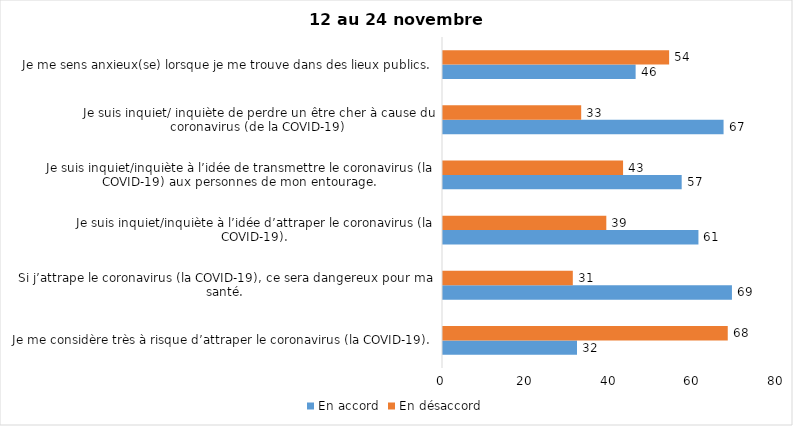
| Category | En accord | En désaccord |
|---|---|---|
| Je me considère très à risque d’attraper le coronavirus (la COVID-19). | 32 | 68 |
| Si j’attrape le coronavirus (la COVID-19), ce sera dangereux pour ma santé. | 69 | 31 |
| Je suis inquiet/inquiète à l’idée d’attraper le coronavirus (la COVID-19). | 61 | 39 |
| Je suis inquiet/inquiète à l’idée de transmettre le coronavirus (la COVID-19) aux personnes de mon entourage. | 57 | 43 |
| Je suis inquiet/ inquiète de perdre un être cher à cause du coronavirus (de la COVID-19) | 67 | 33 |
| Je me sens anxieux(se) lorsque je me trouve dans des lieux publics. | 46 | 54 |